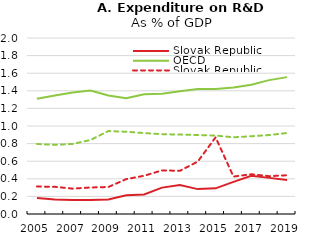
| Category | Slovak Republic | OECD |
|---|---|---|
| 2005.0 | 0.313 | 0.796 |
| 2006.0 | 0.309 | 0.786 |
| 2007.0 | 0.288 | 0.796 |
| 2008.0 | 0.301 | 0.841 |
| 2009.0 | 0.307 | 0.942 |
| 2010.0 | 0.397 | 0.935 |
| 2011.0 | 0.435 | 0.92 |
| 2012.0 | 0.495 | 0.907 |
| 2013.0 | 0.491 | 0.903 |
| 2014.0 | 0.595 | 0.898 |
| 2015.0 | 0.871 | 0.891 |
| 2016.0 | 0.425 | 0.872 |
| 2017.0 | 0.452 | 0.883 |
| 2018.0 | 0.43 | 0.897 |
| 2019.0 | 0.44 | 0.92 |